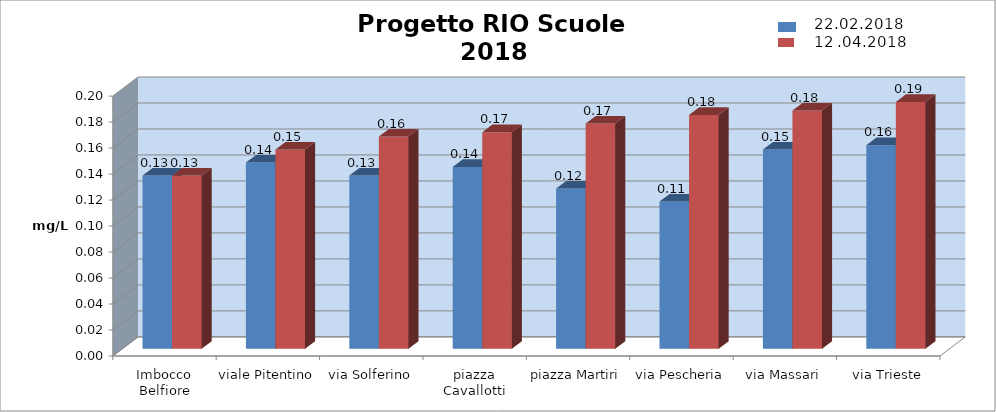
| Category | Series 0 | Series 1 |
|---|---|---|
| Imbocco Belfiore | 0.133 | 0.133 |
| viale Pitentino | 0.143 | 0.153 |
| via Solferino | 0.133 | 0.163 |
| piazza Cavallotti | 0.14 | 0.167 |
| piazza Martiri | 0.123 | 0.173 |
| via Pescheria | 0.113 | 0.18 |
| via Massari | 0.153 | 0.183 |
| via Trieste | 0.157 | 0.19 |